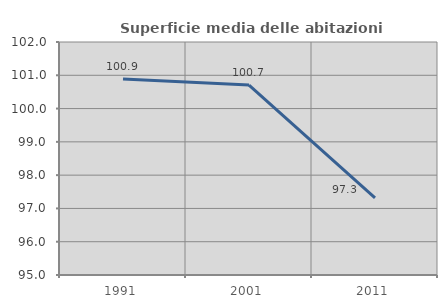
| Category | Superficie media delle abitazioni occupate |
|---|---|
| 1991.0 | 100.887 |
| 2001.0 | 100.707 |
| 2011.0 | 97.32 |